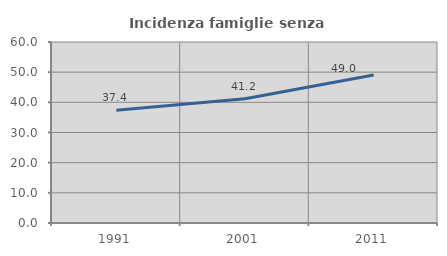
| Category | Incidenza famiglie senza nuclei |
|---|---|
| 1991.0 | 37.404 |
| 2001.0 | 41.176 |
| 2011.0 | 49.032 |